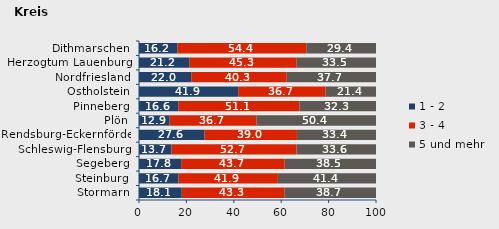
| Category | 1 - 2 | 3 - 4 | 5 und mehr |
|---|---|---|---|
| Stormarn | 18.051 | 43.282 | 38.667 |
| Steinburg | 16.667 | 41.927 | 41.406 |
| Segeberg | 17.772 | 43.678 | 38.55 |
| Schleswig-Flensburg | 13.681 | 52.745 | 33.573 |
| Rendsburg-Eckernförde | 27.605 | 39.036 | 33.359 |
| Plön | 12.941 | 36.667 | 50.392 |
| Pinneberg | 16.6 | 51.083 | 32.318 |
| Ostholstein | 41.872 | 36.749 | 21.379 |
| Nordfriesland | 22.047 | 40.279 | 37.674 |
| Herzogtum Lauenburg | 21.198 | 45.346 | 33.456 |
| Dithmarschen | 16.159 | 54.437 | 29.404 |